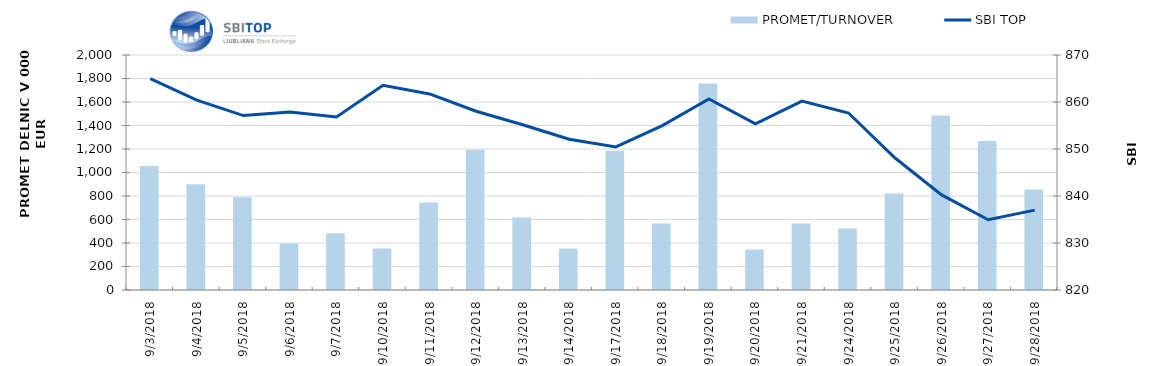
| Category | PROMET/TURNOVER |
|---|---|
| 9/3/18 | 1055 |
| 9/4/18 | 901 |
| 9/5/18 | 789 |
| 9/6/18 | 396 |
| 9/7/18 | 483 |
| 9/10/18 | 354 |
| 9/11/18 | 745 |
| 9/12/18 | 1194 |
| 9/13/18 | 616 |
| 9/14/18 | 353 |
| 9/17/18 | 1185 |
| 9/18/18 | 566 |
| 9/19/18 | 1757 |
| 9/20/18 | 344 |
| 9/21/18 | 567 |
| 9/24/18 | 524 |
| 9/25/18 | 821 |
| 9/26/18 | 1485 |
| 9/27/18 | 1269 |
| 9/28/18 | 855 |